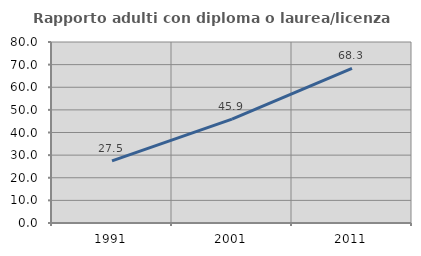
| Category | Rapporto adulti con diploma o laurea/licenza media  |
|---|---|
| 1991.0 | 27.451 |
| 2001.0 | 45.926 |
| 2011.0 | 68.319 |